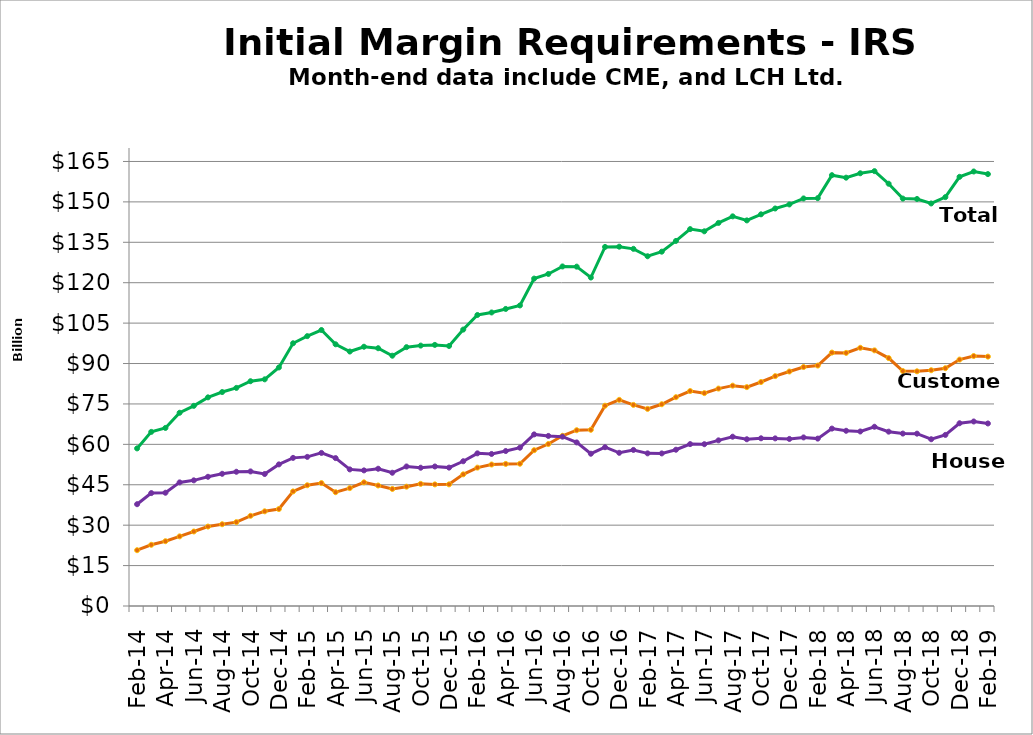
| Category | Customer | House | Total |
|---|---|---|---|
| 2014-02-28 |  |  |  |
| nan |  |  |  |
| 2014-04-30 |  |  |  |
| nan |  |  |  |
| 2014-06-30 |  |  |  |
| nan |  |  |  |
| 2014-08-29 |  |  |  |
| nan |  |  |  |
| 2014-10-31 |  |  |  |
| nan |  |  |  |
| 2014-12-31 |  |  |  |
| nan |  |  |  |
| 2015-02-27 |  |  |  |
| nan |  |  |  |
| 2015-04-30 |  |  |  |
| nan |  |  |  |
| 2015-06-30 |  |  |  |
| nan |  |  |  |
| 2015-08-31 |  |  |  |
| nan |  |  |  |
| 2015-10-30 |  |  |  |
| nan |  |  |  |
| 2015-12-31 |  |  |  |
| nan |  |  |  |
| 2016-02-29 |  |  |  |
| nan |  |  |  |
| 2016-04-29 |  |  |  |
| nan |  |  |  |
| 2016-06-30 |  |  |  |
| nan |  |  |  |
| 2016-08-31 |  |  |  |
| nan |  |  |  |
| 2016-10-31 |  |  |  |
| nan |  |  |  |
| 2016-12-30 |  |  |  |
| nan |  |  |  |
| 2017-02-28 |  |  |  |
| nan |  |  |  |
| 2017-04-28 |  |  |  |
| nan |  |  |  |
| 2017-06-30 |  |  |  |
| nan |  |  |  |
| 2017-08-31 |  |  |  |
| nan |  |  |  |
| 2017-10-31 |  |  |  |
| nan |  |  |  |
| 2017-12-29 |  |  |  |
| nan |  |  |  |
| 2018-02-28 |  |  |  |
| nan |  |  |  |
| 2018-04-30 |  |  |  |
| nan |  |  |  |
| 2018-06-29 |  |  |  |
| nan |  |  |  |
| 2018-08-31 |  |  |  |
| nan |  |  |  |
| 2018-10-31 |  |  |  |
| nan |  |  |  |
| 2018-12-31 |  |  |  |
| nan |  |  |  |
| 2019-02-28 |  |  |  |